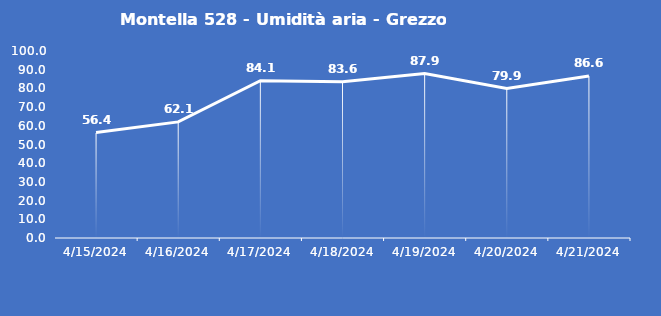
| Category | Montella 528 - Umidità aria - Grezzo (%) |
|---|---|
| 4/15/24 | 56.4 |
| 4/16/24 | 62.1 |
| 4/17/24 | 84.1 |
| 4/18/24 | 83.6 |
| 4/19/24 | 87.9 |
| 4/20/24 | 79.9 |
| 4/21/24 | 86.6 |